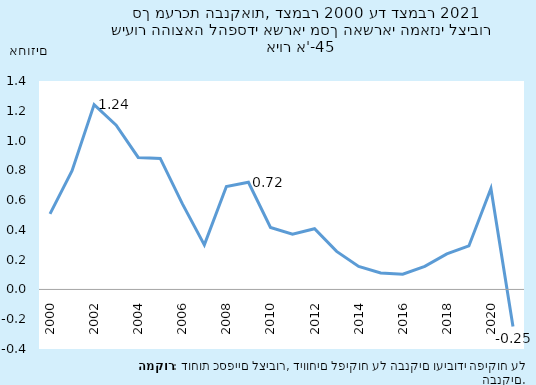
| Category | סך מערכת |
|---|---|
| 2000-12-31 | 0.508 |
| 2001-12-31 | 0.797 |
| 2002-12-31 | 1.241 |
| 2003-12-31 | 1.103 |
| 2004-12-31 | 0.886 |
| 2005-12-31 | 0.88 |
| 2006-12-31 | 0.576 |
| 2007-12-31 | 0.299 |
| 2008-12-31 | 0.691 |
| 2009-12-31 | 0.72 |
| 2010-12-31 | 0.417 |
| 2011-12-31 | 0.372 |
| 2012-12-31 | 0.408 |
| 2013-12-31 | 0.255 |
| 2014-12-31 | 0.155 |
| 2015-12-31 | 0.11 |
| 2016-12-31 | 0.103 |
| 2017-12-31 | 0.155 |
| 2018-12-31 | 0.239 |
| 2019-12-31 | 0.292 |
| 2020-12-31 | 0.678 |
| 2021-12-31 | -0.249 |